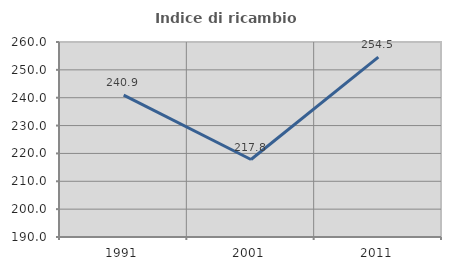
| Category | Indice di ricambio occupazionale  |
|---|---|
| 1991.0 | 240.909 |
| 2001.0 | 217.808 |
| 2011.0 | 254.545 |